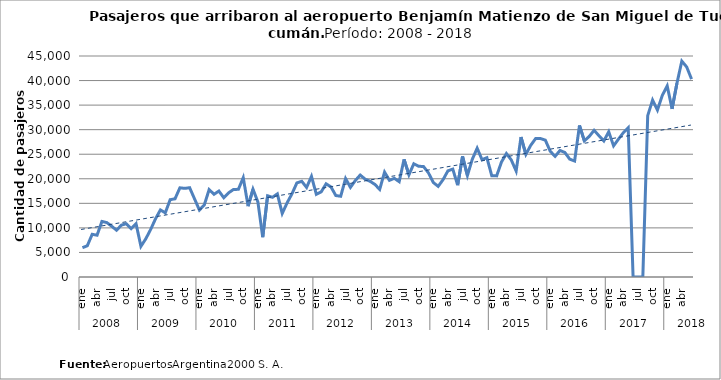
| Category | Cantidad de pasajeros registrados |
|---|---|
| 0 | 5963 |
| 1 | 6361 |
| 2 | 8697 |
| 3 | 8510 |
| 4 | 11314 |
| 5 | 11080 |
| 6 | 10347 |
| 7 | 9524 |
| 8 | 10568 |
| 9 | 10845 |
| 10 | 9853 |
| 11 | 10860 |
| 12 | 6242 |
| 13 | 7774 |
| 14 | 9679 |
| 15 | 11856 |
| 16 | 13658 |
| 17 | 13067 |
| 18 | 15740 |
| 19 | 15925 |
| 20 | 18161 |
| 21 | 18047 |
| 22 | 18183 |
| 23 | 15916 |
| 24 | 13640 |
| 25 | 14649 |
| 26 | 17803 |
| 27 | 16838 |
| 28 | 17506 |
| 29 | 16151 |
| 30 | 17145 |
| 31 | 17824 |
| 32 | 17851 |
| 33 | 20224 |
| 34 | 14419 |
| 35 | 17872 |
| 36 | 15304 |
| 37 | 8107 |
| 38 | 16537 |
| 39 | 16226 |
| 40 | 16924 |
| 41 | 12946 |
| 42 | 15097 |
| 43 | 16937 |
| 44 | 19160 |
| 45 | 19484 |
| 46 | 18236 |
| 47 | 20488 |
| 48 | 16833 |
| 49 | 17342 |
| 50 | 18974 |
| 51 | 18339 |
| 52 | 16586 |
| 53 | 16445 |
| 54 | 20049 |
| 55 | 18248 |
| 56 | 19640 |
| 57 | 20761 |
| 58 | 19936 |
| 59 | 19502 |
| 60 | 18864 |
| 61 | 17832 |
| 62 | 21359 |
| 63 | 19680 |
| 64 | 20097 |
| 65 | 19411 |
| 66 | 23957 |
| 67 | 20812 |
| 68 | 23057 |
| 69 | 22554 |
| 70 | 22486 |
| 71 | 21209 |
| 72 | 19246 |
| 73 | 18453 |
| 74 | 19813 |
| 75 | 21617 |
| 76 | 21970 |
| 77 | 18695 |
| 78 | 24561 |
| 79 | 20670 |
| 80 | 23968 |
| 81 | 26222 |
| 82 | 23892 |
| 83 | 24287 |
| 84 | 20623 |
| 85 | 20592 |
| 86 | 23432 |
| 87 | 25138 |
| 88 | 23839 |
| 89 | 21584 |
| 90 | 28498 |
| 91 | 24972 |
| 92 | 26819 |
| 93 | 28188 |
| 94 | 28188 |
| 95 | 27855 |
| 96 | 25591 |
| 97 | 24574 |
| 98 | 25766 |
| 99 | 25355 |
| 100 | 23995 |
| 101 | 23621 |
| 102 | 30863 |
| 103 | 27723 |
| 104 | 28627 |
| 105 | 29866 |
| 106 | 28770 |
| 107 | 27723 |
| 108 | 29561 |
| 109 | 26693 |
| 110 | 28054 |
| 111 | 29385 |
| 112 | 30393 |
| 113 | 0 |
| 114 | 0 |
| 115 | 0 |
| 116 | 32849 |
| 117 | 36045 |
| 118 | 33994 |
| 119 | 36978 |
| 120 | 38889 |
| 121 | 34228 |
| 122 | 39456 |
| 123 | 43956 |
| 124 | 42764 |
| 125 | 40289 |